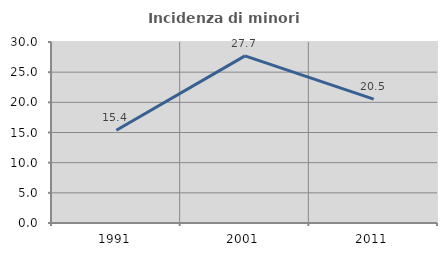
| Category | Incidenza di minori stranieri |
|---|---|
| 1991.0 | 15.385 |
| 2001.0 | 27.692 |
| 2011.0 | 20.526 |